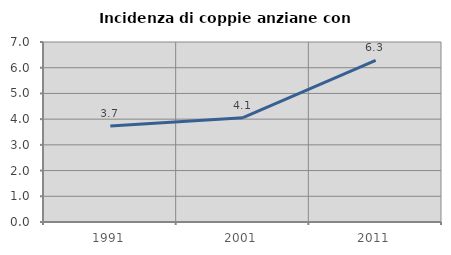
| Category | Incidenza di coppie anziane con figli |
|---|---|
| 1991.0 | 3.734 |
| 2001.0 | 4.056 |
| 2011.0 | 6.286 |